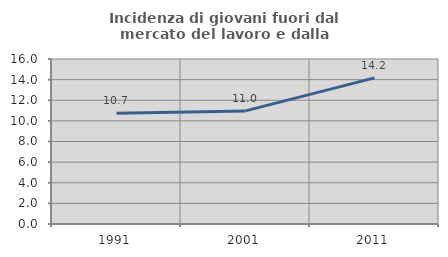
| Category | Incidenza di giovani fuori dal mercato del lavoro e dalla formazione  |
|---|---|
| 1991.0 | 10.748 |
| 2001.0 | 10.968 |
| 2011.0 | 14.167 |